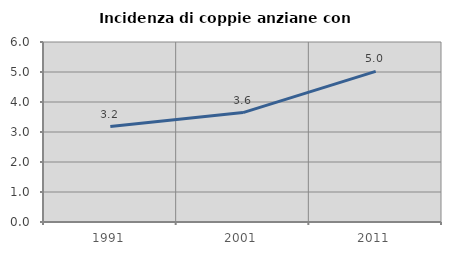
| Category | Incidenza di coppie anziane con figli |
|---|---|
| 1991.0 | 3.18 |
| 2001.0 | 3.647 |
| 2011.0 | 5.021 |